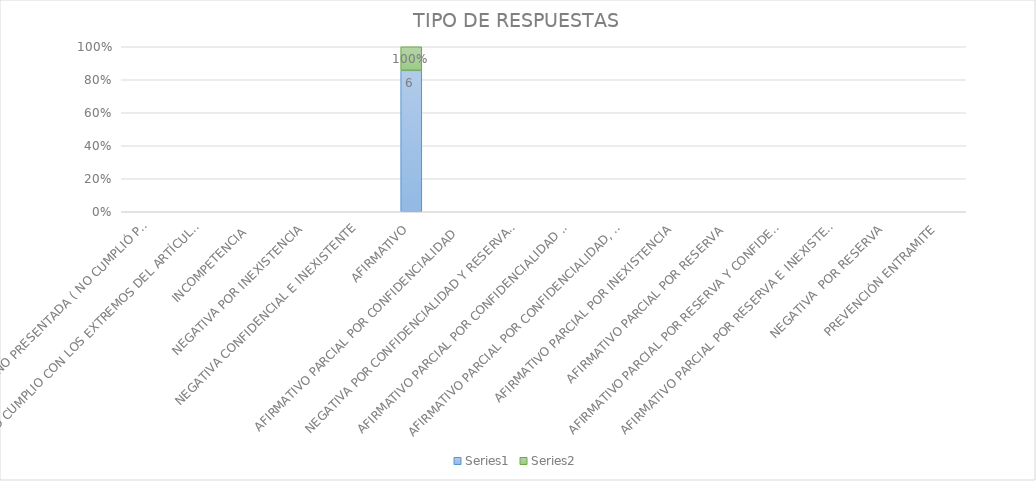
| Category | Series 4 | Series 5 |
|---|---|---|
| SE TIENE POR NO PRESENTADA ( NO CUMPLIÓ PREVENCIÓN) | 0 | 0 |
| NO CUMPLIO CON LOS EXTREMOS DEL ARTÍCULO 79 (REQUISITOS) | 0 | 0 |
| INCOMPETENCIA  | 0 | 0 |
| NEGATIVA POR INEXISTENCIA | 0 | 0 |
| NEGATIVA CONFIDENCIAL E INEXISTENTE | 0 | 0 |
| AFIRMATIVO | 6 | 1 |
| AFIRMATIVO PARCIAL POR CONFIDENCIALIDAD  | 0 | 0 |
| NEGATIVA POR CONFIDENCIALIDAD Y RESERVADA | 0 | 0 |
| AFIRMATIVO PARCIAL POR CONFIDENCIALIDAD E INEXISTENCIA | 0 | 0 |
| AFIRMATIVO PARCIAL POR CONFIDENCIALIDAD, RESERVA E INEXISTENCIA | 0 | 0 |
| AFIRMATIVO PARCIAL POR INEXISTENCIA | 0 | 0 |
| AFIRMATIVO PARCIAL POR RESERVA | 0 | 0 |
| AFIRMATIVO PARCIAL POR RESERVA Y CONFIDENCIALIDAD | 0 | 0 |
| AFIRMATIVO PARCIAL POR RESERVA E INEXISTENCIA | 0 | 0 |
| NEGATIVA  POR RESERVA | 0 | 0 |
| PREVENCIÓN ENTRAMITE | 0 | 0 |